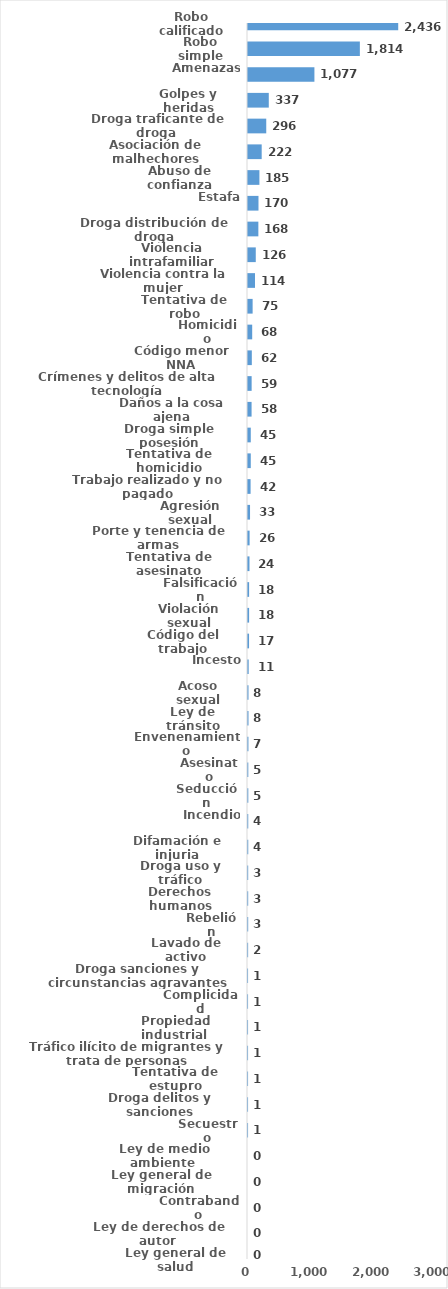
| Category | Series 0 |
|---|---|
| Robo calificado | 2436 |
| Robo simple | 1814 |
| Amenazas | 1077 |
| Golpes y heridas | 337 |
| Droga traficante de droga  | 296 |
| Asociación de malhechores | 222 |
| Abuso de confianza | 185 |
| Estafa | 170 |
| Droga distribución de droga | 168 |
| Violencia intrafamiliar | 126 |
| Violencia contra la mujer | 114 |
| Tentativa de robo | 75 |
| Homicidio | 68 |
| Código menor NNA | 62 |
| Crímenes y delitos de alta tecnología | 59 |
| Daños a la cosa ajena | 58 |
| Droga simple posesión | 45 |
| Tentativa de homicidio | 45 |
| Trabajo realizado y no pagado | 42 |
| Agresión sexual | 33 |
| Porte y tenencia de armas | 26 |
| Tentativa de asesinato | 24 |
| Falsificación | 18 |
| Violación sexual | 18 |
| Código del trabajo | 17 |
| Incesto | 11 |
| Acoso sexual | 8 |
| Ley de tránsito | 8 |
| Envenenamiento | 7 |
| Asesinato | 5 |
| Seducción | 5 |
| Incendio | 4 |
| Difamación e injuria | 4 |
| Droga uso y tráfico | 3 |
| Derechos humanos | 3 |
| Rebelión | 3 |
| Lavado de activo | 2 |
| Droga sanciones y circunstancias agravantes | 1 |
| Complicidad | 1 |
| Propiedad industrial  | 1 |
| Tráfico ilícito de migrantes y trata de personas | 1 |
| Tentativa de estupro | 1 |
| Droga delitos y sanciones | 1 |
| Secuestro | 1 |
| Ley de medio ambiente  | 0 |
| Ley general de migración | 0 |
| Contrabando | 0 |
| Ley de derechos de autor  | 0 |
| Ley general de salud | 0 |